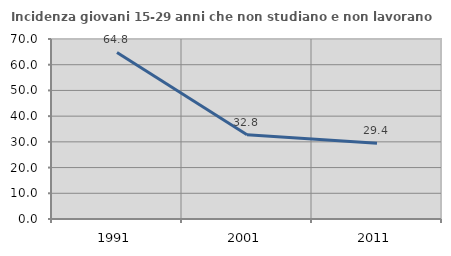
| Category | Incidenza giovani 15-29 anni che non studiano e non lavorano  |
|---|---|
| 1991.0 | 64.779 |
| 2001.0 | 32.761 |
| 2011.0 | 29.444 |